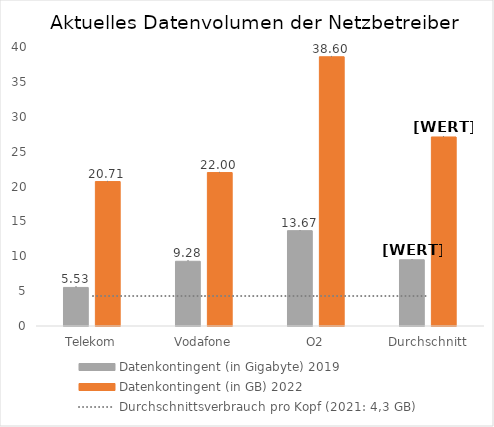
| Category | Datenkontingent (in Gigabyte) 2019 | Datenkontingent (in GB) 2022 |
|---|---|---|
| Telekom | 5.53 | 20.71 |
| Vodafone | 9.28 | 22 |
| O2 | 13.67 | 38.6 |
| Durchschnitt | 9.493 | 27.103 |